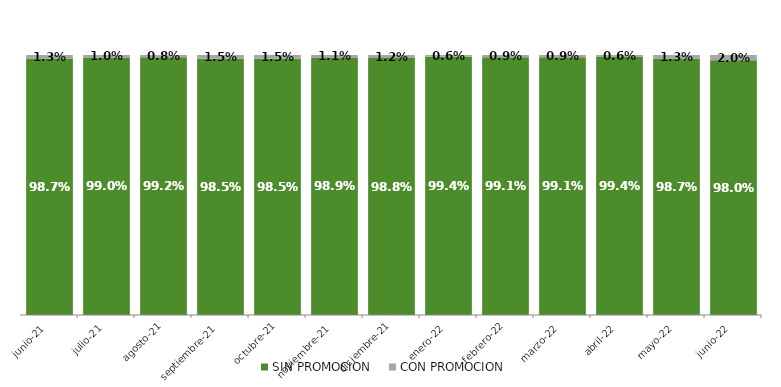
| Category | SIN PROMOCION   | CON PROMOCION   |
|---|---|---|
| 2021-06-01 | 0.987 | 0.013 |
| 2021-07-01 | 0.99 | 0.01 |
| 2021-08-01 | 0.992 | 0.008 |
| 2021-09-01 | 0.985 | 0.015 |
| 2021-10-01 | 0.985 | 0.015 |
| 2021-11-01 | 0.989 | 0.011 |
| 2021-12-01 | 0.988 | 0.012 |
| 2022-01-01 | 0.994 | 0.006 |
| 2022-02-01 | 0.991 | 0.009 |
| 2022-03-01 | 0.991 | 0.009 |
| 2022-04-01 | 0.994 | 0.006 |
| 2022-05-01 | 0.987 | 0.013 |
| 2022-06-01 | 0.98 | 0.02 |